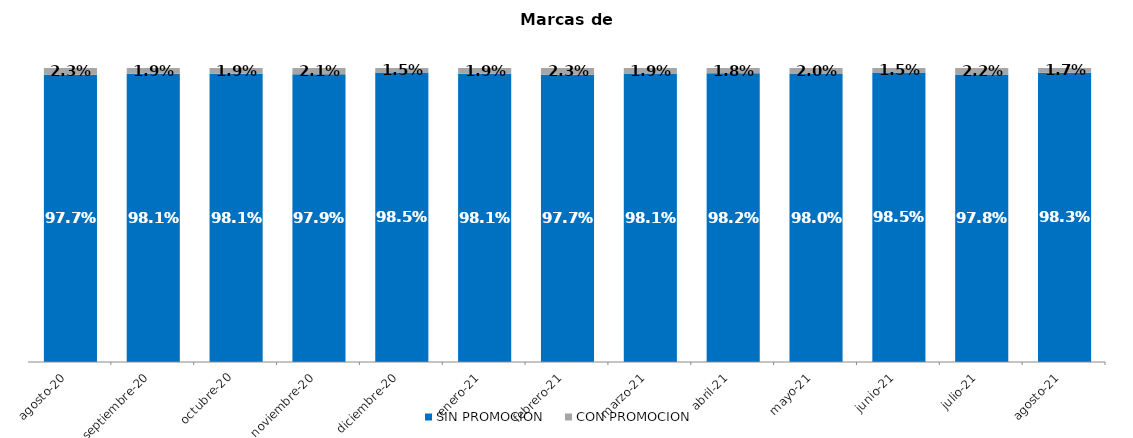
| Category | SIN PROMOCION   | CON PROMOCION   |
|---|---|---|
| 2020-08-01 | 0.977 | 0.023 |
| 2020-09-01 | 0.981 | 0.019 |
| 2020-10-01 | 0.981 | 0.019 |
| 2020-11-01 | 0.979 | 0.021 |
| 2020-12-01 | 0.985 | 0.015 |
| 2021-01-01 | 0.981 | 0.019 |
| 2021-02-01 | 0.977 | 0.023 |
| 2021-03-01 | 0.981 | 0.019 |
| 2021-04-01 | 0.982 | 0.018 |
| 2021-05-01 | 0.98 | 0.02 |
| 2021-06-01 | 0.985 | 0.015 |
| 2021-07-01 | 0.978 | 0.022 |
| 2021-08-01 | 0.983 | 0.017 |